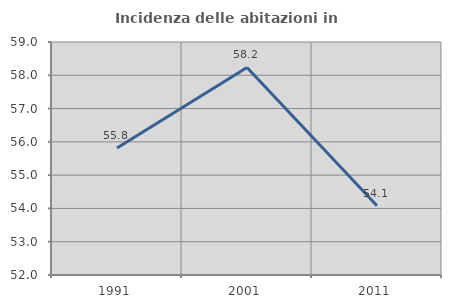
| Category | Incidenza delle abitazioni in proprietà  |
|---|---|
| 1991.0 | 55.817 |
| 2001.0 | 58.235 |
| 2011.0 | 54.081 |